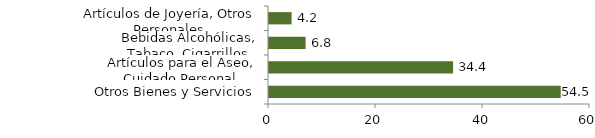
| Category | Otros grupos |
|---|---|
| Otros Bienes y Servicios | 54.528 |
| Artículos para el Aseo, Cuidado Personal | 34.403 |
| Bebidas Alcohólicas, Tabaco, Cigarrillos | 6.844 |
| Artículos de Joyería, Otros Personales | 4.225 |